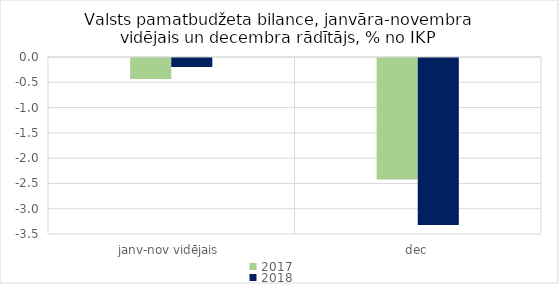
| Category | 2017 | 2018 |
|---|---|---|
| janv-nov vidējais | -0.417 | -0.179 |
| dec | -2.402 | -3.301 |